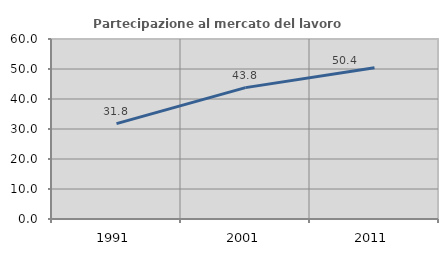
| Category | Partecipazione al mercato del lavoro  femminile |
|---|---|
| 1991.0 | 31.776 |
| 2001.0 | 43.789 |
| 2011.0 | 50.435 |